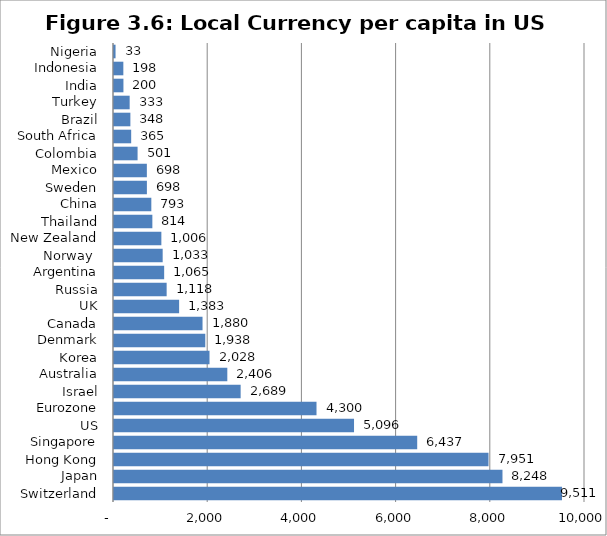
| Category | Series 0 |
|---|---|
| Switzerland | 9511.096 |
| Japan | 8247.91 |
| Hong Kong | 7951.204 |
| Singapore | 6437.351 |
| US | 5096.062 |
| Eurozone | 4299.691 |
| Israel | 2688.763 |
| Australia | 2405.826 |
| Korea | 2027.909 |
| Denmark | 1937.934 |
| Canada | 1879.759 |
| UK | 1382.764 |
| Russia | 1117.807 |
| Argentina | 1065.076 |
| Norway  | 1033.438 |
| New Zealand | 1005.595 |
| Thailand | 814.359 |
| China | 792.52 |
| Sweden | 698.403 |
| Mexico | 697.652 |
| Colombia | 500.677 |
| South Africa | 364.806 |
| Brazil | 347.704 |
| Turkey | 332.619 |
| India | 200.389 |
| Indonesia | 198.246 |
| Nigeria | 32.752 |